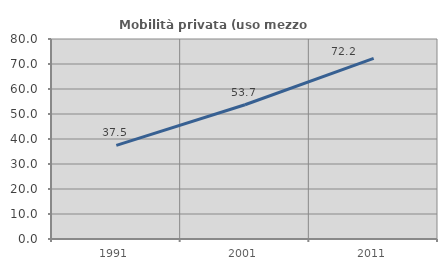
| Category | Mobilità privata (uso mezzo privato) |
|---|---|
| 1991.0 | 37.467 |
| 2001.0 | 53.699 |
| 2011.0 | 72.217 |